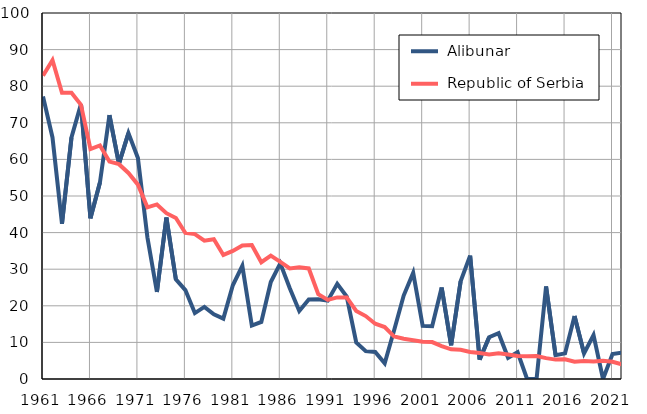
| Category |  Alibunar |  Republic of Serbia |
|---|---|---|
| 1961.0 | 77.2 | 82.9 |
| 1962.0 | 66 | 87.1 |
| 1963.0 | 42.4 | 78.2 |
| 1964.0 | 66 | 78.2 |
| 1965.0 | 75.1 | 74.9 |
| 1966.0 | 43.9 | 62.8 |
| 1967.0 | 53.7 | 63.8 |
| 1968.0 | 72.1 | 59.4 |
| 1969.0 | 58.8 | 58.7 |
| 1970.0 | 67.2 | 56.3 |
| 1971.0 | 60.4 | 53.1 |
| 1972.0 | 38.7 | 46.9 |
| 1973.0 | 23.8 | 47.7 |
| 1974.0 | 44.1 | 45.3 |
| 1975.0 | 27.2 | 44 |
| 1976.0 | 24.3 | 39.9 |
| 1977.0 | 18 | 39.6 |
| 1978.0 | 19.7 | 37.8 |
| 1979.0 | 17.7 | 38.2 |
| 1980.0 | 16.5 | 33.9 |
| 1981.0 | 25.6 | 35 |
| 1982.0 | 30.9 | 36.5 |
| 1983.0 | 14.6 | 36.6 |
| 1984.0 | 15.6 | 31.9 |
| 1985.0 | 26.5 | 33.7 |
| 1986.0 | 31.6 | 32 |
| 1987.0 | 24.8 | 30.2 |
| 1988.0 | 18.6 | 30.5 |
| 1989.0 | 21.7 | 30.2 |
| 1990.0 | 21.8 | 23.2 |
| 1991.0 | 21.4 | 21.6 |
| 1992.0 | 26 | 22.3 |
| 1993.0 | 22.5 | 22.3 |
| 1994.0 | 10 | 18.6 |
| 1995.0 | 7.6 | 17.2 |
| 1996.0 | 7.4 | 15.1 |
| 1997.0 | 4.3 | 14.2 |
| 1998.0 | 13.4 | 11.6 |
| 1999.0 | 22.8 | 11 |
| 2000.0 | 29 | 10.6 |
| 2001.0 | 14.5 | 10.2 |
| 2002.0 | 14.4 | 10.1 |
| 2003.0 | 25 | 9 |
| 2004.0 | 9.2 | 8.1 |
| 2005.0 | 26.7 | 8 |
| 2006.0 | 33.7 | 7.4 |
| 2007.0 | 5.3 | 7.1 |
| 2008.0 | 11.4 | 6.7 |
| 2009.0 | 12.5 | 7 |
| 2010.0 | 5.8 | 6.7 |
| 2011.0 | 7.3 | 6.3 |
| 2012.0 | 0 | 6.2 |
| 2013.0 | 0 | 6.3 |
| 2014.0 | 25.3 | 5.7 |
| 2015.0 | 6.5 | 5.3 |
| 2016.0 | 7 | 5.4 |
| 2017.0 | 17.2 | 4.7 |
| 2018.0 | 7 | 4.9 |
| 2019.0 | 12 | 4.8 |
| 2020.0 | 0 | 5 |
| 2021.0 | 6.8 | 4.7 |
| 2022.0 | 7.2 | 4 |